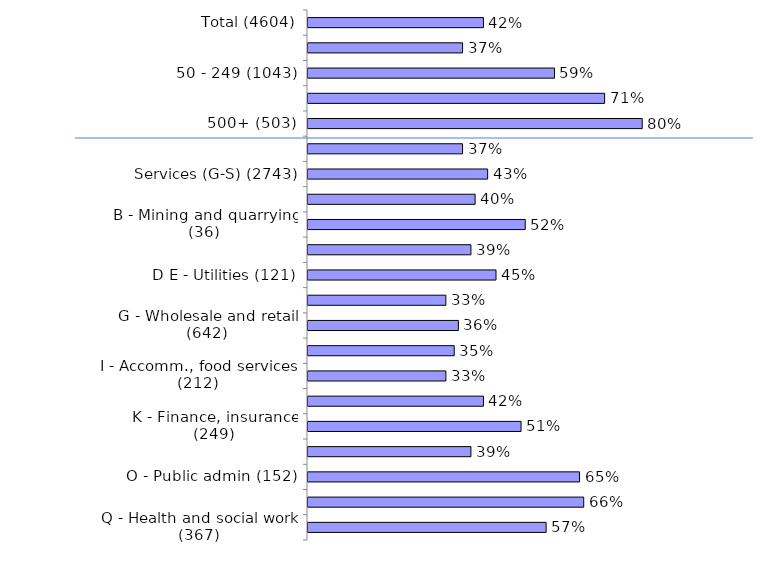
| Category | Series 0 |
|---|---|
| Total (4604) | 0.42 |
| 10 - 49 (2678) | 0.37 |
| 50 - 249 (1043) | 0.59 |
| 250 - 499 (380) | 0.71 |
| 500+ (503) | 0.8 |
| Production (A-F) (1861) | 0.37 |
| Services (G-S) (2743) | 0.43 |
| A - Agriculture (135) | 0.4 |
| B - Mining and quarrying (36) | 0.52 |
| C - Manufacturing (1396) | 0.39 |
| D E - Utilities (121) | 0.45 |
| F - Construction (173) | 0.33 |
| G - Wholesale and retail (642) | 0.36 |
| H - Transport , storage (203) | 0.35 |
| I - Accomm., food services (212) | 0.33 |
| J - Information, comms (170) | 0.42 |
| K - Finance, insurance (249) | 0.51 |
| LMNRS - Bus/tech/admin/arts/other (366) | 0.39 |
| O - Public admin (152) | 0.65 |
| P - Education (382) | 0.66 |
| Q - Health and social work (367) | 0.57 |